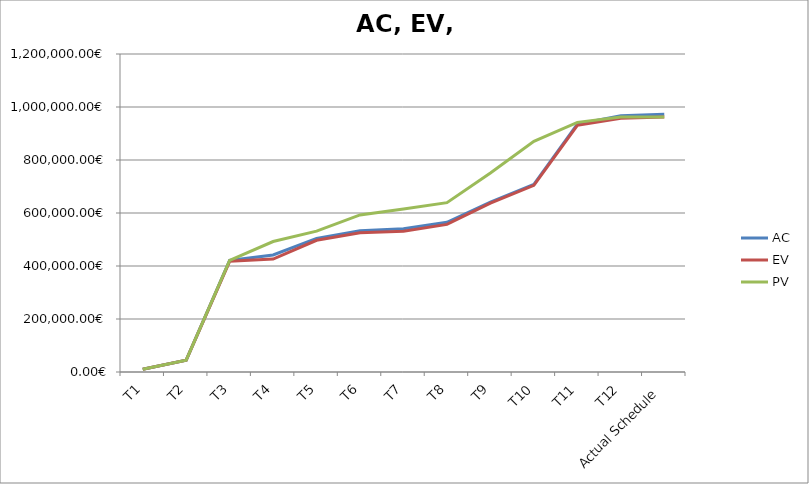
| Category | AC | EV | PV |
|---|---|---|---|
| T1 | 10455.74 | 10455.74 | 10455.74 |
| T2 | 44479.32 | 44479.32 | 44479.32 |
| T3 | 420765.848 | 417645.848 | 420765.848 |
| T4 | 441565.848 | 425965.848 | 492368.066 |
| T5 | 504128.066 | 497168.066 | 531491.186 |
| T6 | 532691.186 | 525091.186 | 592736.016 |
| T7 | 540371.186 | 531491.186 | 614876.136 |
| T8 | 564988.076 | 557068.076 | 638959.726 |
| T9 | 640783.296 | 637183.296 | 750824.105 |
| T10 | 708041.976 | 704441.976 | 870408.449 |
| T11 | 935581.558 | 930706.892 | 942021.558 |
| T12 | 966581.558 | 957573.558 | 962181.558 |
| Actual Schedule | 972341.558 | 962181.558 | 962181.558 |